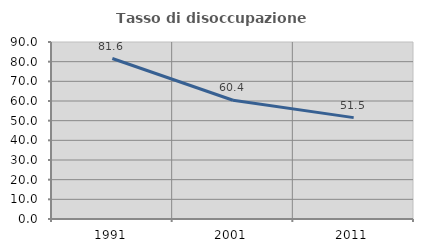
| Category | Tasso di disoccupazione giovanile  |
|---|---|
| 1991.0 | 81.596 |
| 2001.0 | 60.403 |
| 2011.0 | 51.542 |